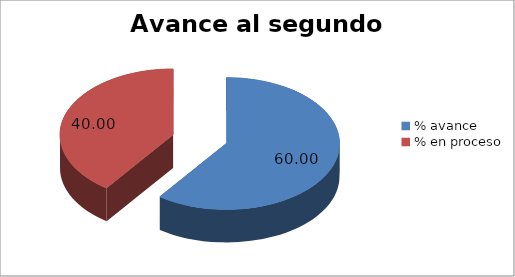
| Category | Series 0 |
|---|---|
| % avance | 60 |
| % en proceso | 40 |